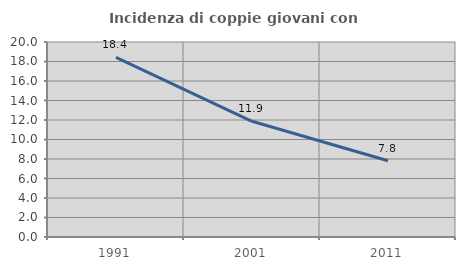
| Category | Incidenza di coppie giovani con figli |
|---|---|
| 1991.0 | 18.419 |
| 2001.0 | 11.868 |
| 2011.0 | 7.823 |